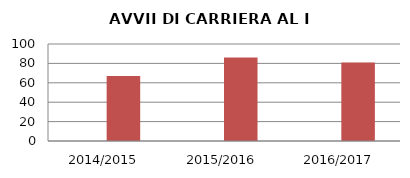
| Category | ANNO | NUMERO |
|---|---|---|
| 2014/2015 | 0 | 67 |
| 2015/2016 | 0 | 86 |
| 2016/2017 | 0 | 81 |